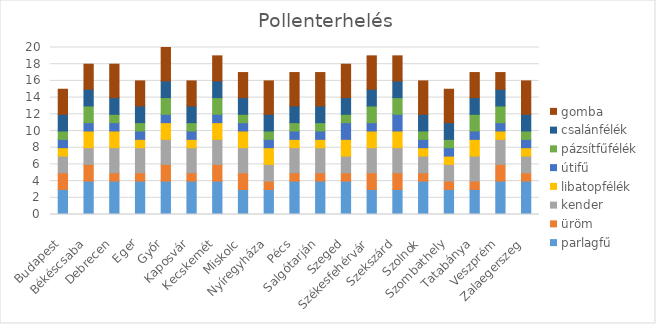
| Category | parlagfű | üröm | kender | libatopfélék | útifű | pázsítfűfélék | csalánfélék | gomba |
|---|---|---|---|---|---|---|---|---|
| Budapest | 3 | 2 | 2 | 1 | 1 | 1 | 2 | 3 |
| Békéscsaba | 4 | 2 | 2 | 2 | 1 | 2 | 2 | 3 |
| Debrecen | 4 | 1 | 3 | 2 | 1 | 1 | 2 | 4 |
| Eger | 4 | 1 | 3 | 1 | 1 | 1 | 2 | 3 |
| Győr | 4 | 2 | 3 | 2 | 1 | 2 | 2 | 4 |
| Kaposvár | 4 | 1 | 3 | 1 | 1 | 1 | 2 | 3 |
| Kecskemét | 4 | 2 | 3 | 2 | 1 | 2 | 2 | 3 |
| Miskolc | 3 | 2 | 3 | 2 | 1 | 1 | 2 | 3 |
| Nyíregyháza | 3 | 1 | 2 | 2 | 1 | 1 | 2 | 4 |
| Pécs | 4 | 1 | 3 | 1 | 1 | 1 | 2 | 4 |
| Salgótarján | 4 | 1 | 3 | 1 | 1 | 1 | 2 | 4 |
| Szeged | 4 | 1 | 2 | 2 | 2 | 1 | 2 | 4 |
| Székesfehérvár | 3 | 2 | 3 | 2 | 1 | 2 | 2 | 4 |
| Szekszárd | 3 | 2 | 3 | 2 | 2 | 2 | 2 | 3 |
| Szolnok | 4 | 1 | 2 | 1 | 1 | 1 | 2 | 4 |
| Szombathely | 3 | 1 | 2 | 1 | 1 | 1 | 2 | 4 |
| Tatabánya | 3 | 1 | 3 | 2 | 1 | 2 | 2 | 3 |
| Veszprém | 4 | 2 | 3 | 1 | 1 | 2 | 2 | 2 |
| Zalaegerszeg | 4 | 1 | 2 | 1 | 1 | 1 | 2 | 4 |